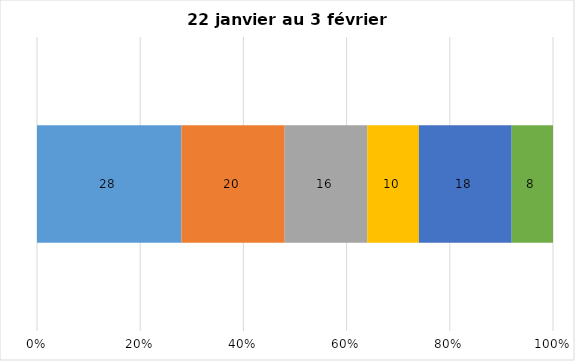
| Category | Plusieurs fois par jour | Une fois par jour | Quelques fois par semaine   | Une fois par semaine ou moins   |  Jamais   |  Je n’utilise pas les médias sociaux |
|---|---|---|---|---|---|---|
| 0 | 28 | 20 | 16 | 10 | 18 | 8 |